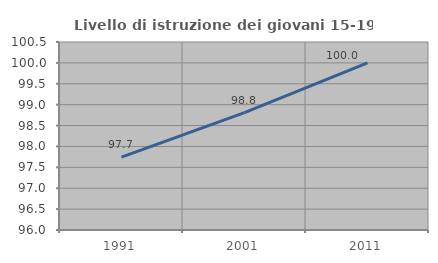
| Category | Livello di istruzione dei giovani 15-19 anni |
|---|---|
| 1991.0 | 97.744 |
| 2001.0 | 98.81 |
| 2011.0 | 100 |